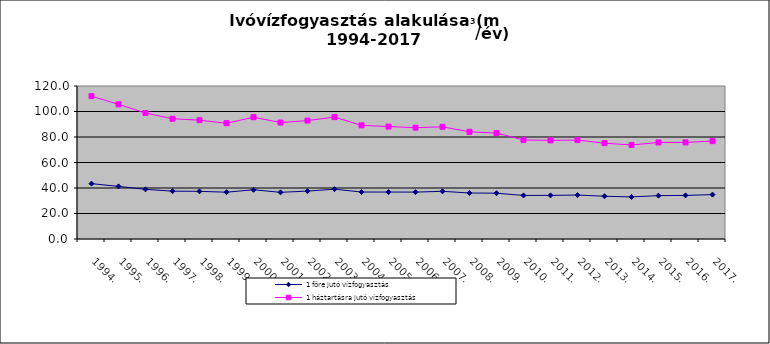
| Category | 1 főre jutó vízfogyasztás | 1 háztartásra jutó vízfogyasztás |
|---|---|---|
| 1994. | 43.421 | 112.049 |
| 1995. | 41.263 | 105.635 |
| 1996. | 38.95 | 98.807 |
| 1997. | 37.52 | 94.316 |
| 1998. | 37.378 | 93.189 |
| 1999. | 36.715 | 90.794 |
| 2000. | 38.623 | 95.518 |
| 2001. | 36.603 | 91.358 |
| 2002. | 37.583 | 92.88 |
| 2003. | 39.063 | 95.595 |
| 2004. | 36.843 | 89.154 |
| 2005. | 36.834 | 88.173 |
| 2006. | 36.773 | 87.335 |
| 2007. | 37.404 | 87.984 |
| 2008. | 36.069 | 84.085 |
| 2009. | 35.926 | 83.077 |
| 2010. | 34.157 | 77.689 |
| 2011. | 34.227 | 77.371 |
| 2012. | 34.472 | 77.594 |
| 2013. | 33.538 | 75.15 |
| 2014. | 33.002 | 73.757 |
| 2015. | 34.01 | 75.734 |
| 2016. | 34.181 | 75.76 |
| 2017. | 34.817 | 76.755 |